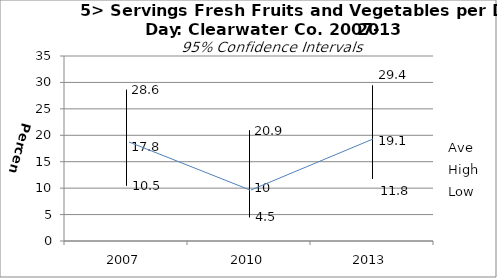
| Category | Ave | High | Low |
|---|---|---|---|
| 2007.0 | 17.8 | 28.6 | 10.5 |
| 2010.0 | 10 | 20.9 | 4.5 |
| 2013.0 | 19.1 | 29.4 | 11.8 |